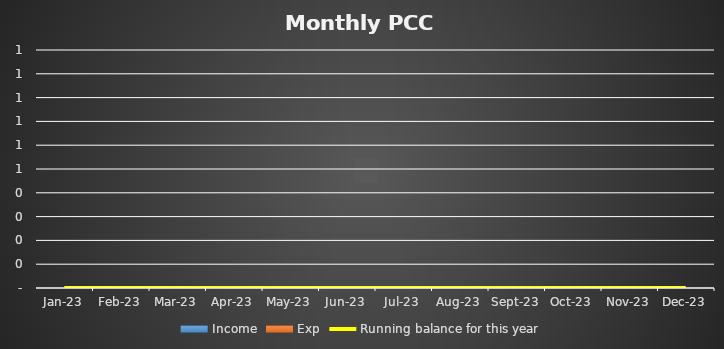
| Category | Income | Exp |
|---|---|---|
| 2023-01-01 | 0 | 0 |
| 2023-02-01 | 0 | 0 |
| 2023-03-01 | 0 | 0 |
| 2023-04-01 | 0 | 0 |
| 2023-05-01 | 0 | 0 |
| 2023-06-01 | 0 | 0 |
| 2023-07-01 | 0 | 0 |
| 2023-08-01 | 0 | 0 |
| 2023-09-01 | 0 | 0 |
| 2023-10-01 | 0 | 0 |
| 2023-11-01 | 0 | 0 |
| 2023-12-01 | 0 | 0 |